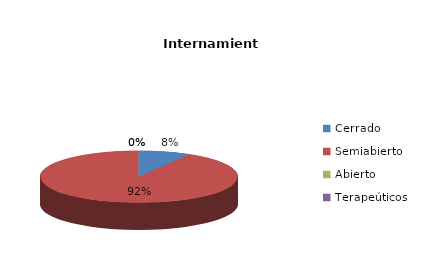
| Category | Series 0 |
|---|---|
| Cerrado | 3 |
| Semiabierto | 33 |
| Abierto | 0 |
| Terapeúticos | 0 |